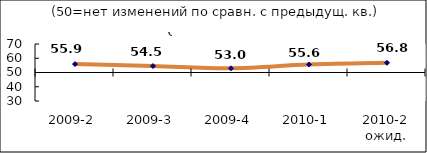
| Category | Диф.индекс ↓ |
|---|---|
| 2009-2 | 55.93 |
| 2009-3 | 54.535 |
| 2009-4 | 52.96 |
| 2010-1 | 55.59 |
| 2010-2 ожид. | 56.8 |